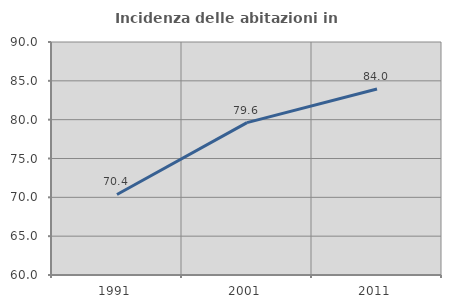
| Category | Incidenza delle abitazioni in proprietà  |
|---|---|
| 1991.0 | 70.37 |
| 2001.0 | 79.62 |
| 2011.0 | 83.953 |